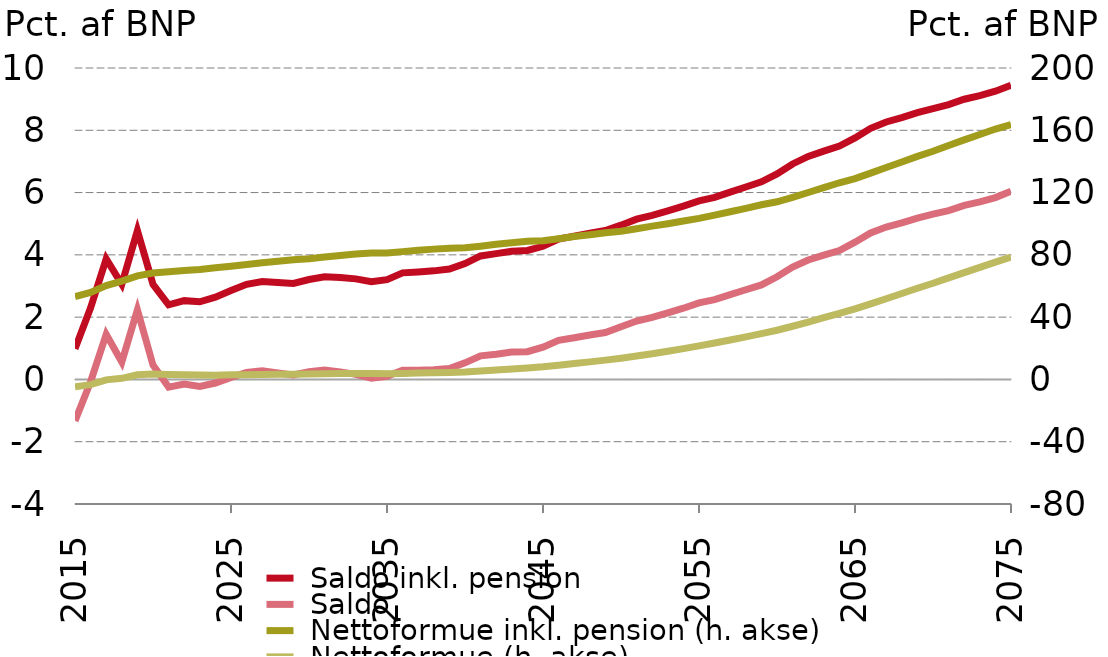
| Category | nullinje |  Saldo inkl. pension |  Saldo |
|---|---|---|---|
| 2015-01-01 | 0 | 0.986 | -1.33 |
| 2016-01-01 | 0 | 2.299 | -0.073 |
| 2017-01-01 | 0 | 3.871 | 1.45 |
| 2018-01-01 | 0 | 3.055 | 0.559 |
| 2019-01-01 | 0 | 4.777 | 2.237 |
| 2020-01-01 | 0 | 3.054 | 0.461 |
| 2021-01-01 | 0 | 2.394 | -0.245 |
| 2022-01-01 | 0 | 2.53 | -0.147 |
| 2023-01-01 | 0 | 2.493 | -0.222 |
| 2024-01-01 | 0 | 2.641 | -0.116 |
| 2025-01-01 | 0 | 2.855 | 0.066 |
| 2026-01-01 | 0 | 3.055 | 0.225 |
| 2027-01-01 | 0 | 3.144 | 0.278 |
| 2028-01-01 | 0 | 3.11 | 0.206 |
| 2029-01-01 | 0 | 3.083 | 0.143 |
| 2030-01-01 | 0 | 3.209 | 0.248 |
| 2031-01-01 | 0 | 3.296 | 0.299 |
| 2032-01-01 | 0 | 3.275 | 0.242 |
| 2033-01-01 | 0 | 3.229 | 0.161 |
| 2034-01-01 | 0 | 3.135 | 0.036 |
| 2035-01-01 | 0 | 3.204 | 0.103 |
| 2036-01-01 | 0 | 3.422 | 0.295 |
| 2037-01-01 | 0 | 3.452 | 0.296 |
| 2038-01-01 | 0 | 3.486 | 0.308 |
| 2039-01-01 | 0 | 3.545 | 0.352 |
| 2040-01-01 | 0 | 3.72 | 0.532 |
| 2041-01-01 | 0 | 3.964 | 0.757 |
| 2042-01-01 | 0 | 4.039 | 0.809 |
| 2043-01-01 | 0 | 4.118 | 0.878 |
| 2044-01-01 | 0 | 4.141 | 0.89 |
| 2045-01-01 | 0 | 4.276 | 1.038 |
| 2046-01-01 | 0 | 4.506 | 1.256 |
| 2047-01-01 | 0 | 4.602 | 1.337 |
| 2048-01-01 | 0 | 4.694 | 1.426 |
| 2049-01-01 | 0 | 4.78 | 1.506 |
| 2050-01-01 | 0 | 4.953 | 1.69 |
| 2051-01-01 | 0 | 5.145 | 1.874 |
| 2052-01-01 | 0 | 5.268 | 1.991 |
| 2053-01-01 | 0 | 5.412 | 2.136 |
| 2054-01-01 | 0 | 5.565 | 2.286 |
| 2055-01-01 | 0 | 5.732 | 2.458 |
| 2056-01-01 | 0 | 5.848 | 2.564 |
| 2057-01-01 | 0 | 6.015 | 2.721 |
| 2058-01-01 | 0 | 6.179 | 2.879 |
| 2059-01-01 | 0 | 6.344 | 3.035 |
| 2060-01-01 | 0 | 6.597 | 3.297 |
| 2061-01-01 | 0 | 6.919 | 3.607 |
| 2062-01-01 | 0 | 7.161 | 3.835 |
| 2063-01-01 | 0 | 7.33 | 3.99 |
| 2064-01-01 | 0 | 7.493 | 4.139 |
| 2065-01-01 | 0 | 7.756 | 4.407 |
| 2066-01-01 | 0 | 8.064 | 4.704 |
| 2067-01-01 | 0 | 8.266 | 4.895 |
| 2068-01-01 | 0 | 8.41 | 5.028 |
| 2069-01-01 | 0 | 8.567 | 5.177 |
| 2070-01-01 | 0 | 8.698 | 5.308 |
| 2071-01-01 | 0 | 8.823 | 5.423 |
| 2072-01-01 | 0 | 8.997 | 5.588 |
| 2073-01-01 | 0 | 9.113 | 5.701 |
| 2074-01-01 | 0 | 9.255 | 5.838 |
| 2075-01-01 | 0 | 9.446 | 6.041 |